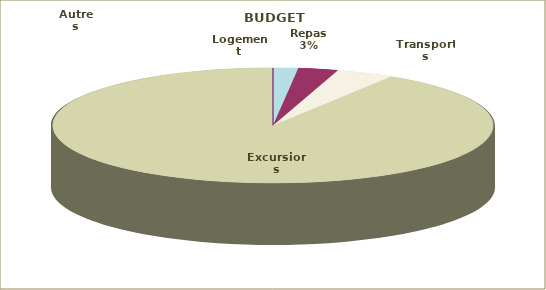
| Category | Series 0 |
|---|---|
| Logement | 17.121 |
| Repas | 27.268 |
| Transports | 39.688 |
| Excursions | 858.731 |
| Autres | 0.056 |